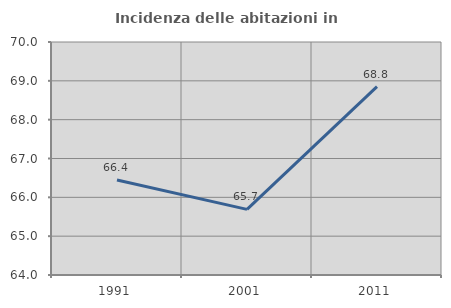
| Category | Incidenza delle abitazioni in proprietà  |
|---|---|
| 1991.0 | 66.448 |
| 2001.0 | 65.69 |
| 2011.0 | 68.85 |